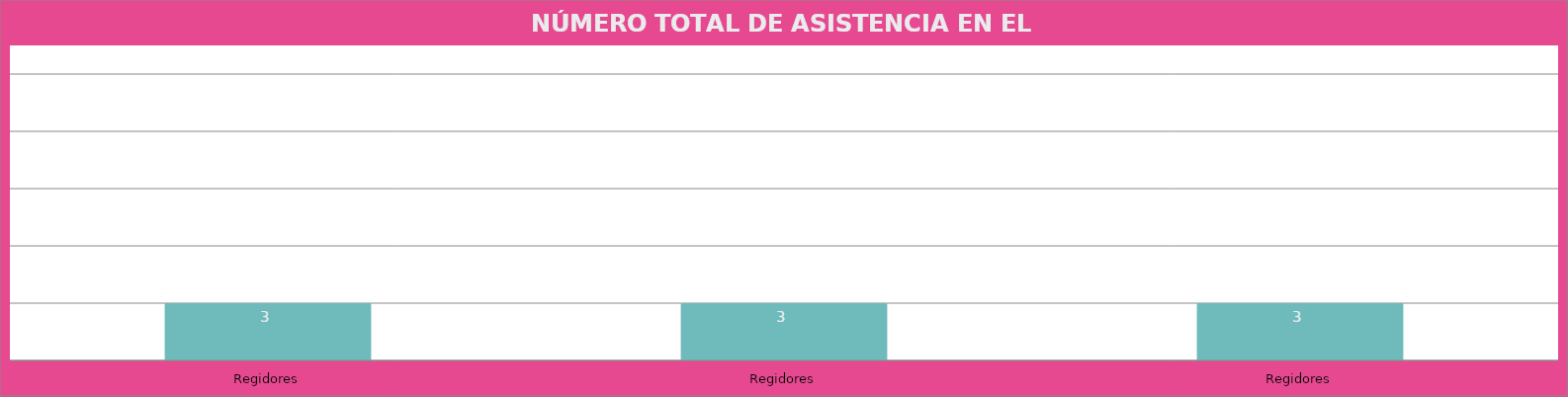
| Category | Regidores |
|---|---|
| Regidores | 3 |
| Regidores | 3 |
| Regidores | 3 |